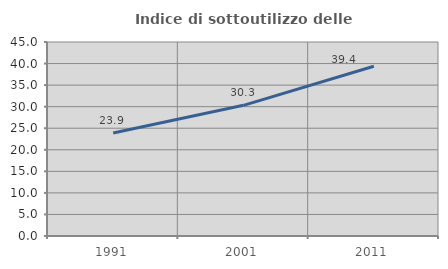
| Category | Indice di sottoutilizzo delle abitazioni  |
|---|---|
| 1991.0 | 23.871 |
| 2001.0 | 30.311 |
| 2011.0 | 39.381 |